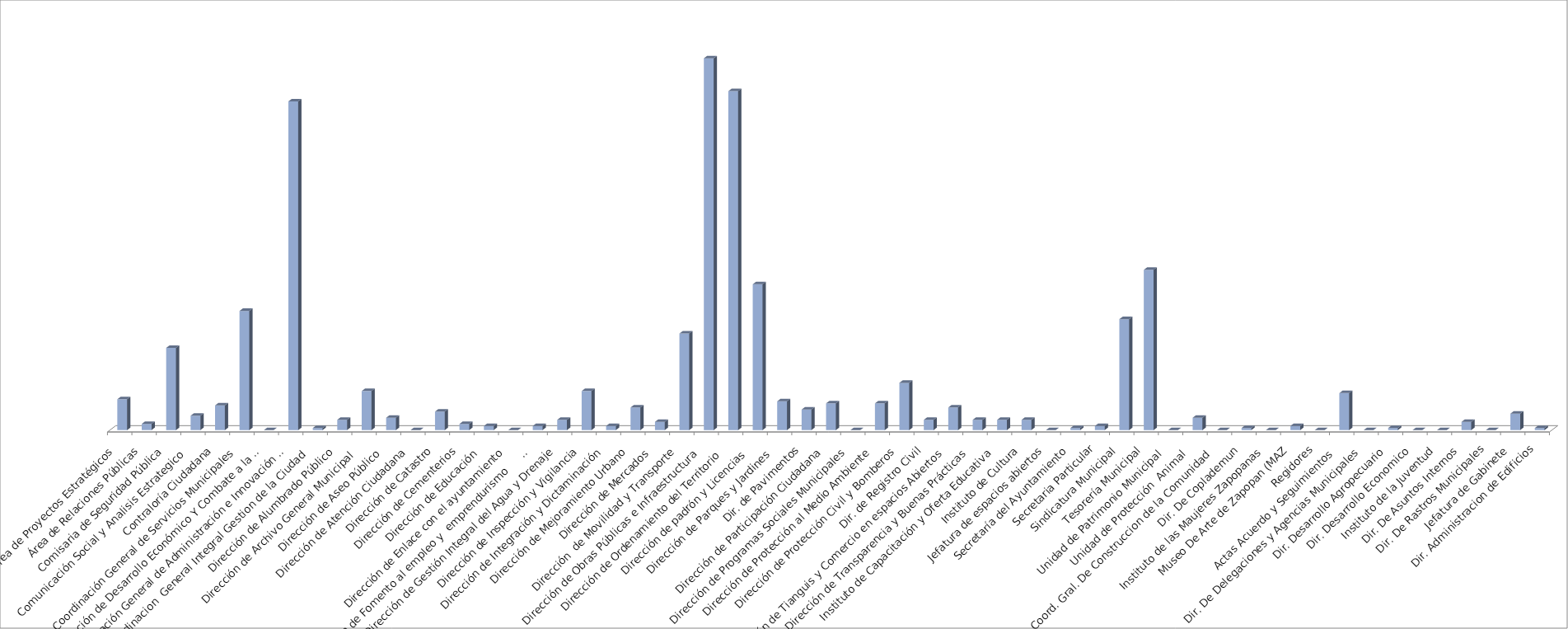
| Category | Series 0 | Series 1 |
|---|---|---|
| Area de Proyectos Estratégicos |  | 15 |
| Área de Relaciones Públicas |  | 3 |
| Comisaria de Seguridad Pública |  | 40 |
| Comunicación Social y Analisis Estrategico  |  | 7 |
| Contraloría Ciudadana |  | 12 |
| Coordinación General de Servicios Municipales |  | 58 |
| Coordinación de Desarrollo Económico Y Combate a la Desigualdad |  | 0 |
| Coordinación General de Administración e Innovación Gubernamental |  | 160 |
| Coordinacion  General Integral Gestion de la Ciudad |  | 1 |
| Dirección de Alumbrado Público |  | 5 |
| Dirección de Archivo General Municipal  |  | 19 |
| Dirección de Aseo Público  |  | 6 |
| Dirección de Atención Ciudadana |  | 0 |
| Dirección de Catastro |  | 9 |
| Dirección de Cementerios |  | 3 |
| Dirección de Educación  |  | 2 |
| Dirección de Enlace con el ayuntamiento |  | 0 |
| Dirección de Fomento al empleo y  emprendurismo         |  | 2 |
| Dirección de Gestión Integral del Agua y Drenaje |  | 5 |
| Dirección de Inspección y Vigilancia |  | 19 |
| Dirección de Integración y Dictaminación |  | 2 |
| Dirección de Mejoramiento Urbano |  | 11 |
| Dirección de Mercados  |  | 4 |
| Dirección  de Movilidad y Transporte |  | 47 |
| Dirección de Obras Públicas e Infraestructura |  | 181 |
| Dirección de Ordenamiento del Territorio  |  | 165 |
| Dirección de padrón y Licencias  |  | 71 |
| Dirección de Parques y Jardines  |  | 14 |
| Dir. de Pavimentos |  | 10 |
| Dirección de Participación Ciudadana |  | 13 |
| Dirección de Programas Sociales Municipales |  | 0 |
| Dirección de Protección al Medio Ambiente  |  | 13 |
| Dirección de Protección Civil y Bomberos |  | 23 |
| Dir. de Registro Civil |  | 5 |
| Dirección de Tianguis y Comercio en espacios Abiertos |  | 11 |
| Dirección de Transparencia y Buenas Prácticas |  | 5 |
| Instituto de Capacitación y Oferta Educativa |  | 5 |
| Instituto de Cultura  |  | 5 |
| Jefatura de espacios abiertos |  | 0 |
| Secretaría del Ayuntamiento |  | 1 |
| Secretaria Particular |  | 2 |
| Sindicatura Municipal |  | 54 |
| Tesorería Municipal |  | 78 |
| Unidad de Patrimonio Municipal  |  | 0 |
| Unidad de Protección  Animal  |  | 6 |
| Coord. Gral. De Construccion de la Comunidad |  | 0 |
| Dir. De Coplademun |  | 1 |
| Instituto de las Maujeres Zapopanas |  | 0 |
| Museo De Arte de Zapopan (MAZ |  | 2 |
| Regidores |  | 0 |
| Actas Acuerdo y Seguimientos  |  | 18 |
| Dir. De Delegaciones y Agencias Municipales |  | 0 |
|  Dir. Desarrollo Agropecuario |  | 1 |
| Dir. Desarrollo Economico |  | 0 |
| Instituto de la Juventud |  | 0 |
| Dir. De Asuntos Internos |  | 4 |
| Dir. De Rastros Municipales |  | 0 |
| Jefatura de Gabinete |  | 8 |
| Dir. Administracion de Edificios |  | 1 |